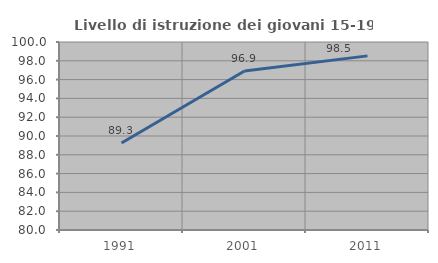
| Category | Livello di istruzione dei giovani 15-19 anni |
|---|---|
| 1991.0 | 89.262 |
| 2001.0 | 96.91 |
| 2011.0 | 98.523 |